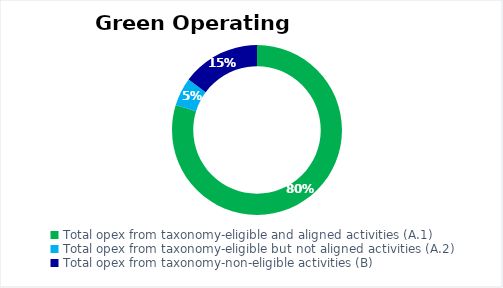
| Category | Series 0 |
|---|---|
| Total opex from taxonomy-eligible and aligned activities (A.1) | 0.803 |
| Total opex from taxonomy-eligible but not aligned activities (A.2) | 0.054 |
| Total opex from taxonomy-non-eligible activities (B) | 0.15 |